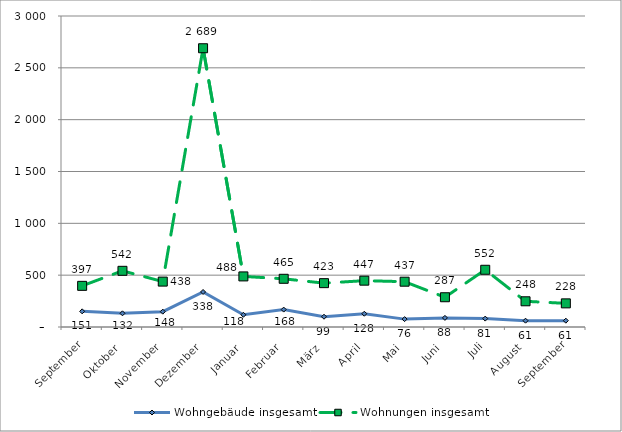
| Category | Wohngebäude insgesamt | Wohnungen insgesamt |
|---|---|---|
| September | 151 | 397 |
| Oktober | 132 | 542 |
| November | 148 | 438 |
| Dezember | 338 | 2689 |
| Januar | 118 | 488 |
| Februar | 168 | 465 |
| März | 99 | 423 |
| April | 128 | 447 |
| Mai | 76 | 437 |
| Juni | 88 | 287 |
| Juli | 81 | 552 |
| August | 61 | 248 |
| September | 61 | 228 |